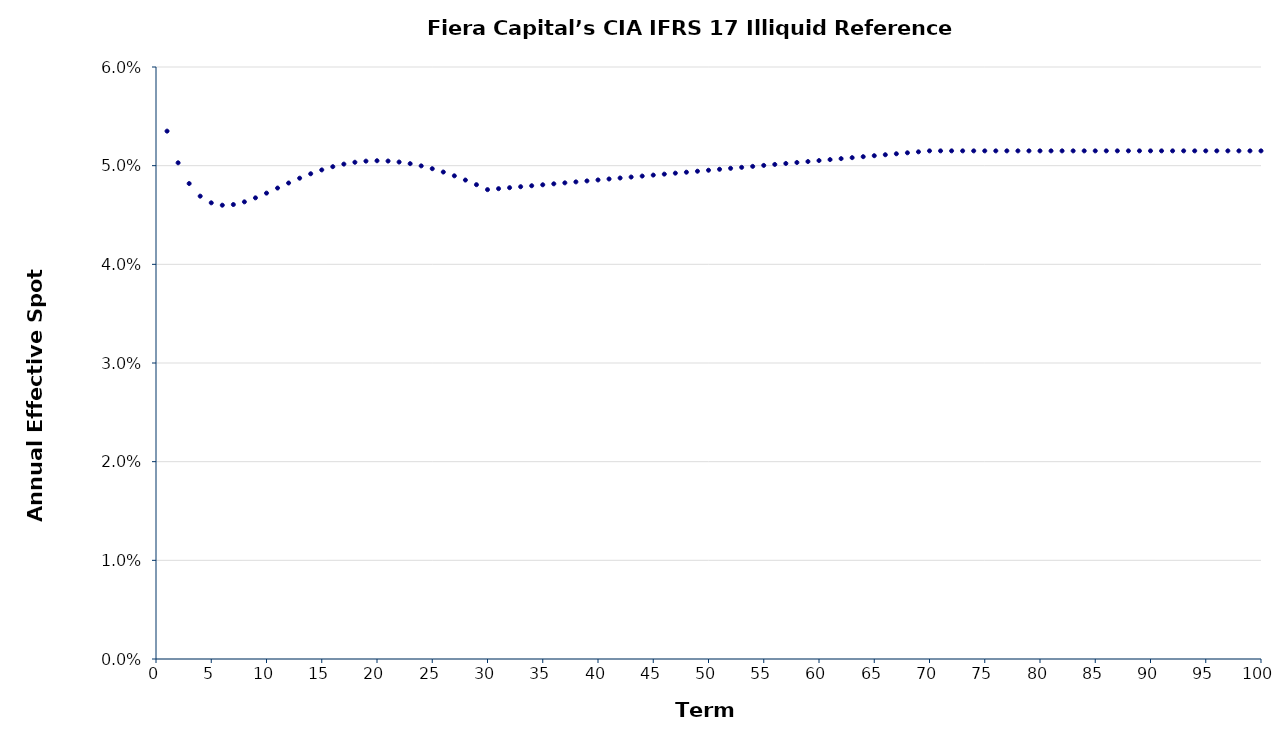
| Category | Annual Effective Spot Rate |
|---|---|
| 1.0 | 0.054 |
| 2.0 | 0.05 |
| 3.0 | 0.048 |
| 4.0 | 0.047 |
| 5.0 | 0.046 |
| 6.0 | 0.046 |
| 7.0 | 0.046 |
| 8.0 | 0.046 |
| 9.0 | 0.047 |
| 10.0 | 0.047 |
| 11.0 | 0.048 |
| 12.0 | 0.048 |
| 13.0 | 0.049 |
| 14.0 | 0.049 |
| 15.0 | 0.05 |
| 16.0 | 0.05 |
| 17.0 | 0.05 |
| 18.0 | 0.05 |
| 19.0 | 0.05 |
| 20.0 | 0.05 |
| 21.0 | 0.05 |
| 22.0 | 0.05 |
| 23.0 | 0.05 |
| 24.0 | 0.05 |
| 25.0 | 0.05 |
| 26.0 | 0.049 |
| 27.0 | 0.049 |
| 28.0 | 0.049 |
| 29.0 | 0.048 |
| 30.0 | 0.048 |
| 31.0 | 0.048 |
| 32.0 | 0.048 |
| 33.0 | 0.048 |
| 34.0 | 0.048 |
| 35.0 | 0.048 |
| 36.0 | 0.048 |
| 37.0 | 0.048 |
| 38.0 | 0.048 |
| 39.0 | 0.048 |
| 40.0 | 0.049 |
| 41.0 | 0.049 |
| 42.0 | 0.049 |
| 43.0 | 0.049 |
| 44.0 | 0.049 |
| 45.0 | 0.049 |
| 46.0 | 0.049 |
| 47.0 | 0.049 |
| 48.0 | 0.049 |
| 49.0 | 0.049 |
| 50.0 | 0.05 |
| 51.0 | 0.05 |
| 52.0 | 0.05 |
| 53.0 | 0.05 |
| 54.0 | 0.05 |
| 55.0 | 0.05 |
| 56.0 | 0.05 |
| 57.0 | 0.05 |
| 58.0 | 0.05 |
| 59.0 | 0.05 |
| 60.0 | 0.051 |
| 61.0 | 0.051 |
| 62.0 | 0.051 |
| 63.0 | 0.051 |
| 64.0 | 0.051 |
| 65.0 | 0.051 |
| 66.0 | 0.051 |
| 67.0 | 0.051 |
| 68.0 | 0.051 |
| 69.0 | 0.051 |
| 70.0 | 0.052 |
| 71.0 | 0.052 |
| 72.0 | 0.052 |
| 73.0 | 0.052 |
| 74.0 | 0.052 |
| 75.0 | 0.052 |
| 76.0 | 0.052 |
| 77.0 | 0.052 |
| 78.0 | 0.052 |
| 79.0 | 0.052 |
| 80.0 | 0.052 |
| 81.0 | 0.052 |
| 82.0 | 0.052 |
| 83.0 | 0.052 |
| 84.0 | 0.052 |
| 85.0 | 0.052 |
| 86.0 | 0.052 |
| 87.0 | 0.052 |
| 88.0 | 0.052 |
| 89.0 | 0.052 |
| 90.0 | 0.052 |
| 91.0 | 0.052 |
| 92.0 | 0.052 |
| 93.0 | 0.052 |
| 94.0 | 0.052 |
| 95.0 | 0.052 |
| 96.0 | 0.052 |
| 97.0 | 0.052 |
| 98.0 | 0.052 |
| 99.0 | 0.052 |
| 100.0 | 0.052 |